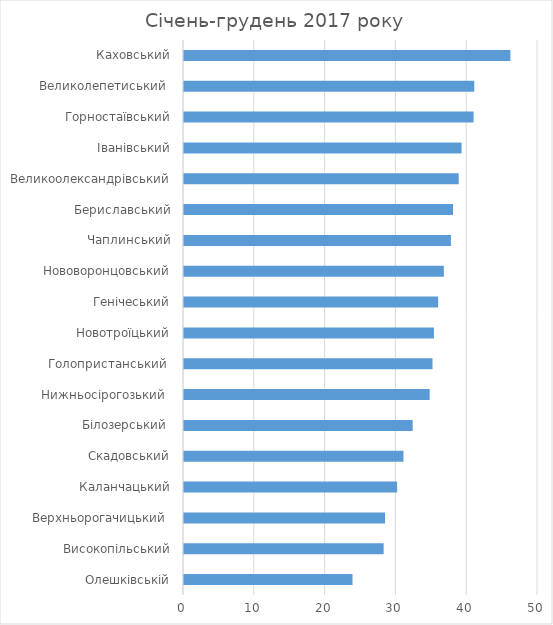
| Category | Series 0 |
|---|---|
| Олешківській | 23.8 |
| Високопільський | 28.2 |
| Верхньорогачицький  | 28.4 |
| Каланчацький | 30.1 |
| Скадовський | 31 |
| Білозерський  | 32.3 |
| Нижньосірогозький  | 34.7 |
| Голопристанський  | 35.1 |
| Новотроїцький | 35.3 |
| Генічеський | 35.9 |
| Нововоронцовський | 36.7 |
| Чаплинський | 37.7 |
| Бериславський | 38 |
| Великоолександрівський | 38.8 |
| Іванівський | 39.2 |
| Горностаївський | 40.9 |
| Великолепетиський  | 41 |
| Каховський | 46.1 |